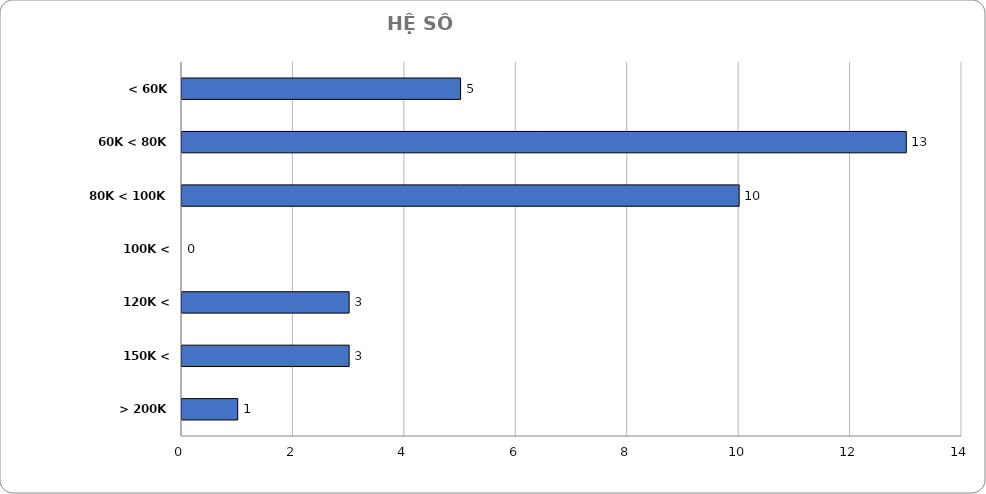
| Category | Series 0 |
|---|---|
| < 60K | 5 |
| 60K < 80K | 13 |
| 80K < 100K | 10 |
| 100K < 120K | 0 |
| 120K < 150K | 3 |
| 150K < 200K | 3 |
| > 200K | 1 |